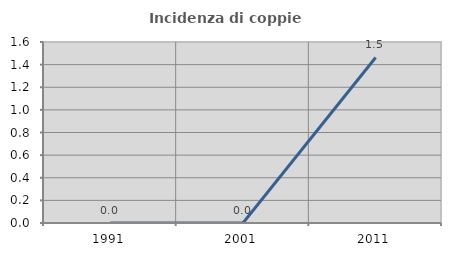
| Category | Incidenza di coppie miste |
|---|---|
| 1991.0 | 0 |
| 2001.0 | 0 |
| 2011.0 | 1.463 |